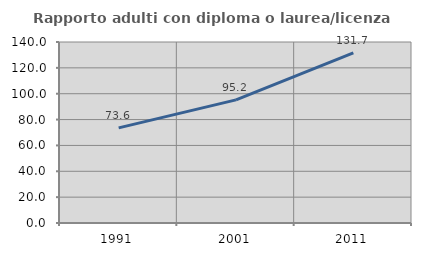
| Category | Rapporto adulti con diploma o laurea/licenza media  |
|---|---|
| 1991.0 | 73.585 |
| 2001.0 | 95.238 |
| 2011.0 | 131.667 |